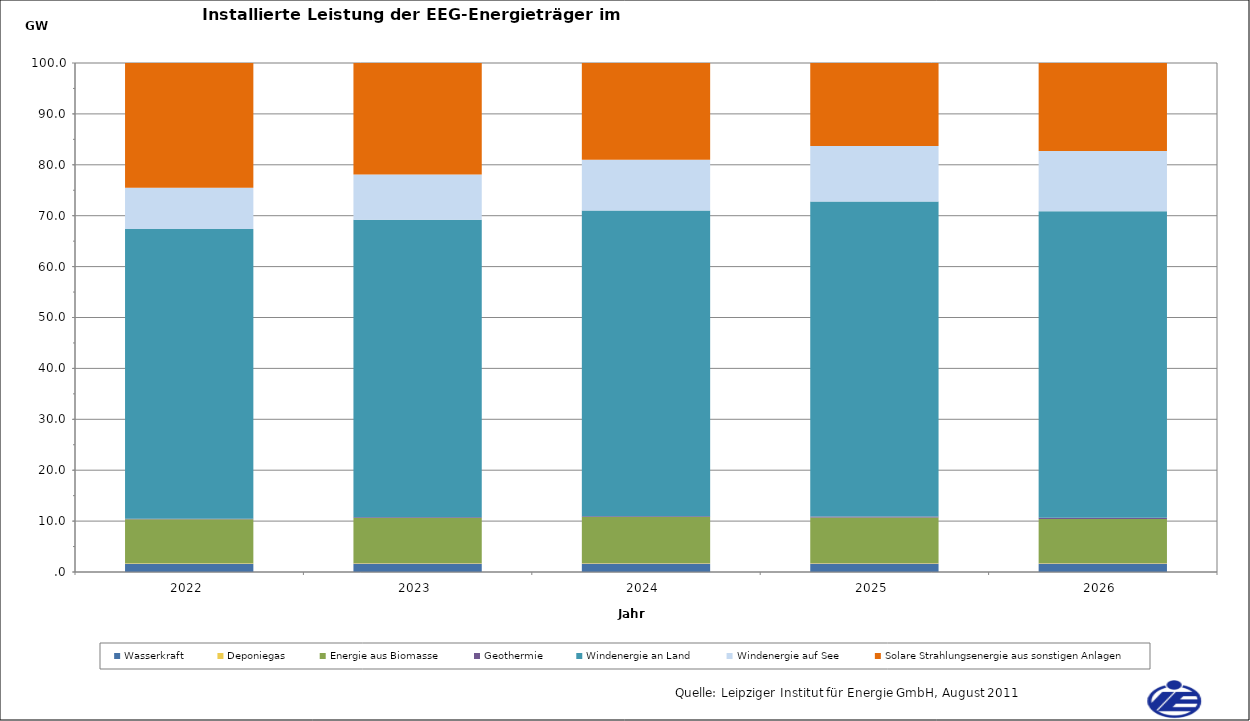
| Category | Wasserkraft | Deponiegas | Energie aus Biomasse | Geothermie | Windenergie an Land | Windenergie auf See | Solare Strahlungsenergie aus sonstigen Anlagen |
|---|---|---|---|---|---|---|---|
| 2022.0 | 1643.781 | 98.599 | 8640.344 | 90.315 | 56890.825 | 8116.218 | 43772.786 |
| 2023.0 | 1651.347 | 97.402 | 8878.522 | 124.065 | 58454.644 | 8865.218 | 47399.594 |
| 2024.0 | 1658.914 | 94.221 | 9031.963 | 161.565 | 60077.931 | 9991.218 | 51112.641 |
| 2025.0 | 1666.481 | 87.072 | 8968.985 | 202.815 | 61884.482 | 10891.218 | 54876.698 |
| 2026.0 | 1674.047 | 86.165 | 8646.758 | 247.815 | 60223.548 | 11849.218 | 58517.84 |